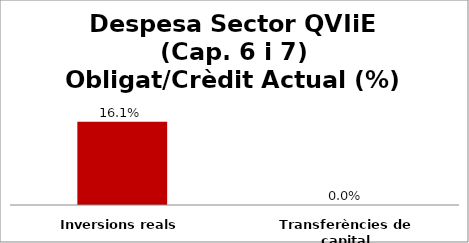
| Category | Series 0 |
|---|---|
| Inversions reals | 0.161 |
| Transferències de capital | 0 |